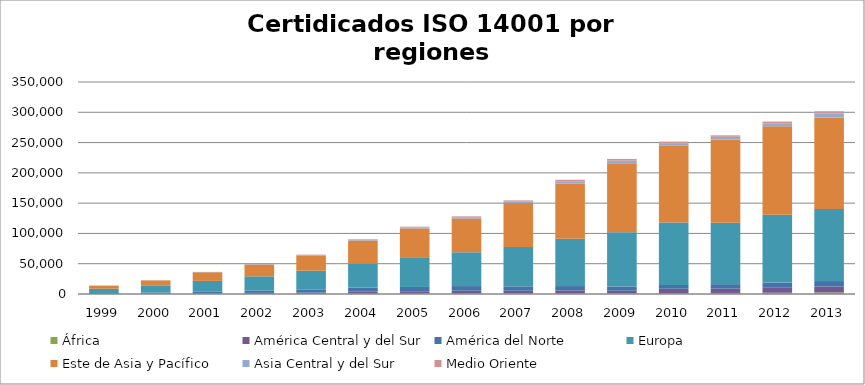
| Category | África | América Central y del Sur | América del Norte | Europa | Este de Asia y Pacífico | Asia Central y del Sur | Medio Oriente |
|---|---|---|---|---|---|---|---|
| 1999.0 | 129 | 309 | 975 | 7253 | 5120 | 114 | 94 |
| 2000.0 | 228 | 556 | 1676 | 10971 | 8993 | 267 | 156 |
| 2001.0 | 311 | 681 | 2700 | 17941 | 14218 | 419 | 194 |
| 2002.0 | 418 | 1418 | 4053 | 23305 | 19307 | 636 | 303 |
| 2003.0 | 626 | 1691 | 5233 | 30918 | 25151 | 927 | 450 |
| 2004.0 | 817 | 2955 | 6743 | 39805 | 38050 | 1322 | 862 |
| 2005.0 | 1130 | 3411 | 7119 | 47837 | 48800 | 1829 | 1037 |
| 2006.0 | 1079 | 4355 | 7673 | 55919 | 55428 | 2201 | 1556 |
| 2007.0 | 1096 | 4260 | 7267 | 65097 | 72350 | 2926 | 1576 |
| 2008.0 | 1518 | 4413 | 7194 | 78118 | 91156 | 3770 | 2405 |
| 2009.0 | 1531 | 3748 | 7316 | 89237 | 113850 | 4517 | 2775 |
| 2010.0 | 1675 | 6999 | 6302 | 103126 | 126551 | 4380 | 2515 |
| 2011.0 | 1740 | 7074 | 7450 | 101177 | 137335 | 4725 | 2425 |
| 2012.0 | 2084 | 8202 | 8573 | 111910 | 146069 | 4969 | 2847 |
| 2013.0 | 2538 | 9890 | 8917 | 119107 | 151089 | 6672 | 3434 |